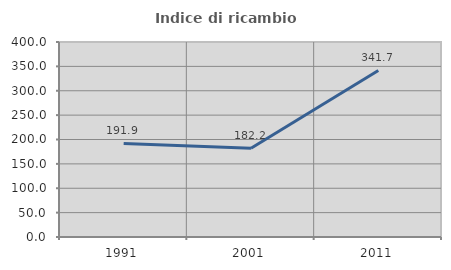
| Category | Indice di ricambio occupazionale  |
|---|---|
| 1991.0 | 191.892 |
| 2001.0 | 182.222 |
| 2011.0 | 341.667 |